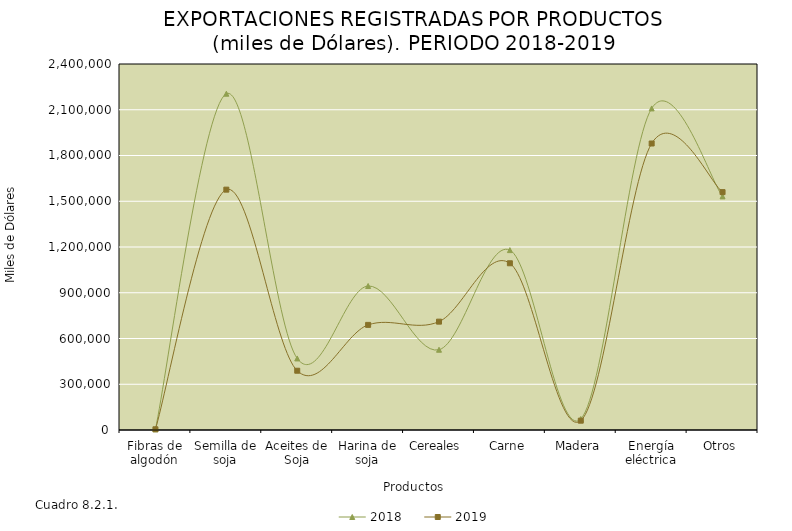
| Category | 2018 | 2019 |
|---|---|---|
| Fibras de algodón | 4844.794 | 4510.634 |
| Semilla de soja | 2205038.912 | 1576120.072 |
| Aceites de Soja | 469237.623 | 388711.294 |
| Harina de soja | 944331.671 | 689277.788 |
| Cereales | 526306.518 | 710471.422 |
| Carne | 1179563.827 | 1093260.955 |
| Madera | 72269.286 | 61109.738 |
| Energía eléctrica | 2108641.674 | 1878673.427 |
| Otros | 1531906.38 | 1559876.966 |